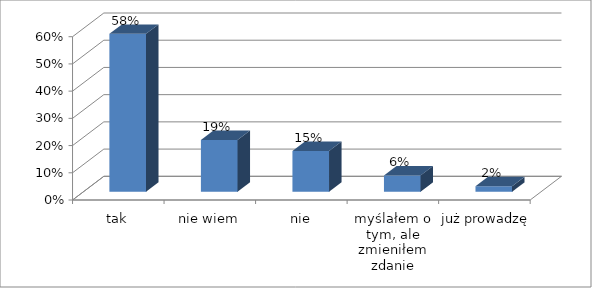
| Category | Series 0 |
|---|---|
| tak | 0.58 |
| nie wiem | 0.19 |
| nie | 0.15 |
| myślałem o tym, ale zmieniłem zdanie | 0.06 |
| już prowadzę | 0.02 |